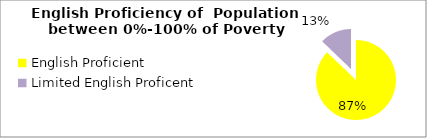
| Category | Percent |
|---|---|
| English Proficient | 0.872 |
| Limited English Proficent | 0.128 |